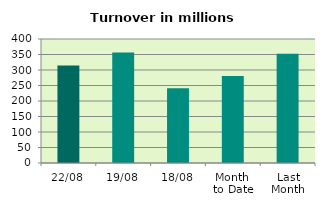
| Category | Series 0 |
|---|---|
| 22/08 | 314.452 |
| 19/08 | 356.176 |
| 18/08 | 240.977 |
| Month 
to Date | 280.854 |
| Last
Month | 352.063 |